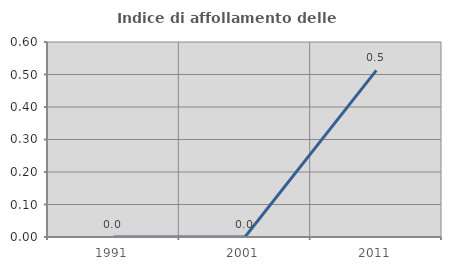
| Category | Indice di affollamento delle abitazioni  |
|---|---|
| 1991.0 | 0 |
| 2001.0 | 0 |
| 2011.0 | 0.513 |